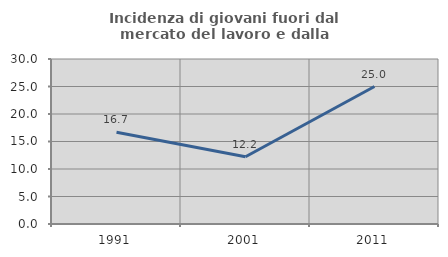
| Category | Incidenza di giovani fuori dal mercato del lavoro e dalla formazione  |
|---|---|
| 1991.0 | 16.667 |
| 2001.0 | 12.234 |
| 2011.0 | 25 |